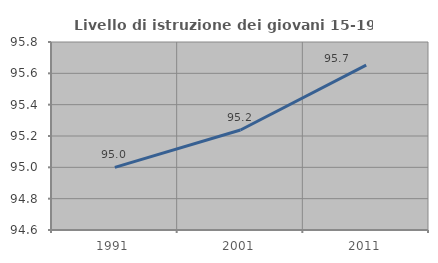
| Category | Livello di istruzione dei giovani 15-19 anni |
|---|---|
| 1991.0 | 95 |
| 2001.0 | 95.238 |
| 2011.0 | 95.652 |